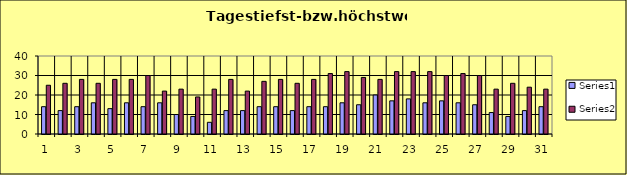
| Category | Series 0 | Series 1 |
|---|---|---|
| 0 | 14 | 25 |
| 1 | 12 | 26 |
| 2 | 14 | 28 |
| 3 | 16 | 26 |
| 4 | 13 | 28 |
| 5 | 16 | 28 |
| 6 | 14 | 30 |
| 7 | 16 | 22 |
| 8 | 10 | 23 |
| 9 | 9 | 19 |
| 10 | 6 | 23 |
| 11 | 12 | 28 |
| 12 | 12 | 22 |
| 13 | 14 | 27 |
| 14 | 14 | 28 |
| 15 | 12 | 26 |
| 16 | 14 | 28 |
| 17 | 14 | 31 |
| 18 | 16 | 32 |
| 19 | 15 | 29 |
| 20 | 20 | 28 |
| 21 | 17 | 32 |
| 22 | 18 | 32 |
| 23 | 16 | 32 |
| 24 | 17 | 30 |
| 25 | 16 | 31 |
| 26 | 15 | 30 |
| 27 | 11 | 23 |
| 28 | 9 | 26 |
| 29 | 12 | 24 |
| 30 | 14 | 23 |